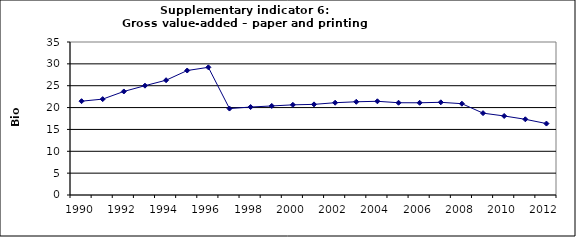
| Category | Gross value-added – paper and printing industry, Bio Euro (EC95) |
|---|---|
| 1990 | 21.463 |
| 1991 | 21.933 |
| 1992 | 23.684 |
| 1993 | 25.007 |
| 1994 | 26.26 |
| 1995 | 28.475 |
| 1996 | 29.209 |
| 1997 | 19.774 |
| 1998 | 20.122 |
| 1999 | 20.37 |
| 2000 | 20.627 |
| 2001 | 20.734 |
| 2002 | 21.111 |
| 2003 | 21.326 |
| 2004 | 21.438 |
| 2005 | 21.105 |
| 2006 | 21.098 |
| 2007 | 21.203 |
| 2008 | 20.887 |
| 2009 | 18.723 |
| 2010 | 18.078 |
| 2011 | 17.32 |
| 2012 | 16.339 |